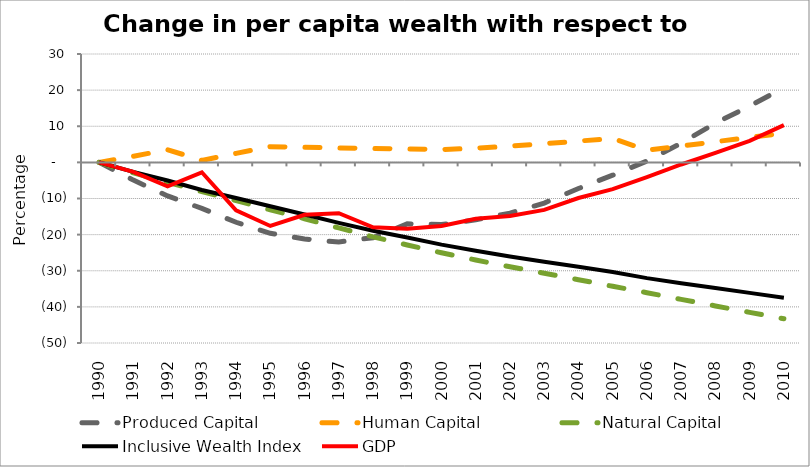
| Category | Produced Capital  | Human Capital | Natural Capital | Inclusive Wealth Index | GDP |
|---|---|---|---|---|---|
| 1990.0 | 0 | 0 | 0 | 0 | 0 |
| 1991.0 | -4.91 | 1.679 | -2.884 | -2.639 | -2.612 |
| 1992.0 | -9.29 | 3.516 | -5.528 | -5.034 | -6.664 |
| 1993.0 | -12.728 | 0.557 | -8.085 | -7.65 | -2.741 |
| 1994.0 | -16.58 | 2.498 | -10.569 | -9.875 | -13.292 |
| 1995.0 | -19.637 | 4.35 | -13.123 | -12.142 | -17.606 |
| 1996.0 | -21.21 | 4.172 | -15.597 | -14.424 | -14.496 |
| 1997.0 | -22.04 | 3.985 | -18.13 | -16.734 | -14.079 |
| 1998.0 | -20.849 | 3.833 | -20.606 | -18.919 | -17.981 |
| 1999.0 | -17.01 | 3.682 | -22.87 | -20.819 | -18.378 |
| 2000.0 | -17.21 | 3.561 | -25.027 | -22.765 | -17.588 |
| 2001.0 | -15.915 | 3.933 | -27.031 | -24.486 | -15.625 |
| 2002.0 | -14.051 | 4.498 | -28.91 | -26.063 | -14.824 |
| 2003.0 | -11.259 | 5.165 | -30.67 | -27.493 | -13.141 |
| 2004.0 | -7.24 | 5.886 | -32.469 | -28.91 | -9.866 |
| 2005.0 | -3.546 | 6.643 | -34.305 | -30.369 | -7.391 |
| 2006.0 | 0.378 | 3.363 | -36.078 | -32.044 | -4.054 |
| 2007.0 | 5.305 | 4.519 | -37.92 | -33.437 | -0.586 |
| 2008.0 | 10.867 | 5.717 | -39.736 | -34.782 | 2.628 |
| 2009.0 | 15.57 | 6.925 | -41.519 | -36.127 | 5.945 |
| 2010.0 | 20.686 | 8.083 | -43.295 | -37.453 | 10.311 |